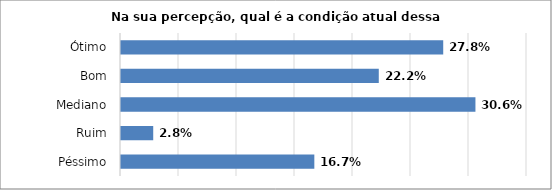
| Category | Series 0 |
|---|---|
| Péssimo | 0.167 |
| Ruim | 0.028 |
| Mediano | 0.306 |
| Bom | 0.222 |
| Ótimo | 0.278 |